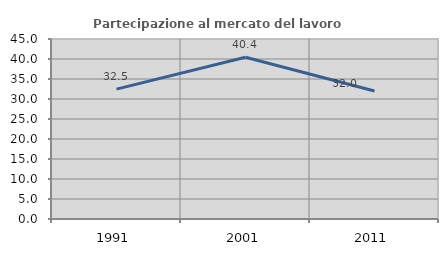
| Category | Partecipazione al mercato del lavoro  femminile |
|---|---|
| 1991.0 | 32.47 |
| 2001.0 | 40.435 |
| 2011.0 | 32.016 |